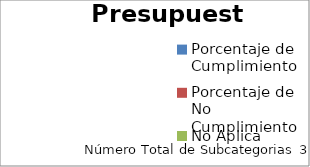
| Category | Presupuesto |
|---|---|
| Porcentaje de Cumplimiento | 0 |
| Porcentaje de No Cumplimiento | 0 |
| No Aplica | 0 |